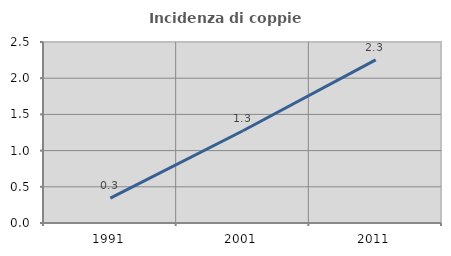
| Category | Incidenza di coppie miste |
|---|---|
| 1991.0 | 0.344 |
| 2001.0 | 1.274 |
| 2011.0 | 2.252 |